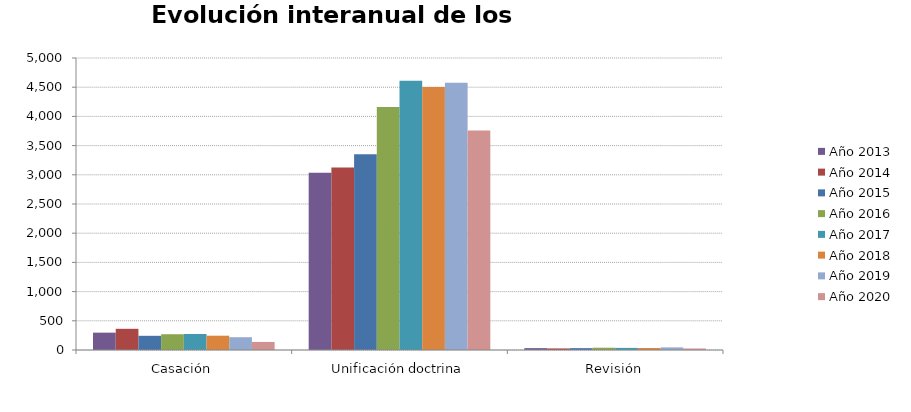
| Category | Año 2013 | Año 2014 | Año 2015 | Año 2016 | Año 2017 | Año 2018 | Año 2019 | Año 2020 |
|---|---|---|---|---|---|---|---|---|
| Casación | 297 | 363 | 243 | 270 | 274 | 245 | 219 | 138 |
| Unificación doctrina | 3036 | 3124 | 3351 | 4163 | 4609 | 4505 | 4575 | 3760 |
| Revisión | 32 | 27 | 32 | 39 | 36 | 34 | 45 | 26 |